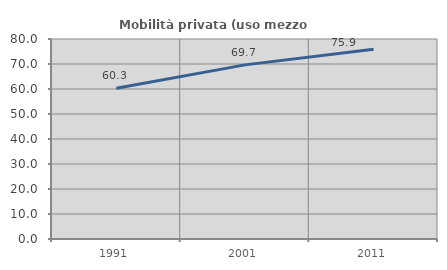
| Category | Mobilità privata (uso mezzo privato) |
|---|---|
| 1991.0 | 60.274 |
| 2001.0 | 69.652 |
| 2011.0 | 75.87 |